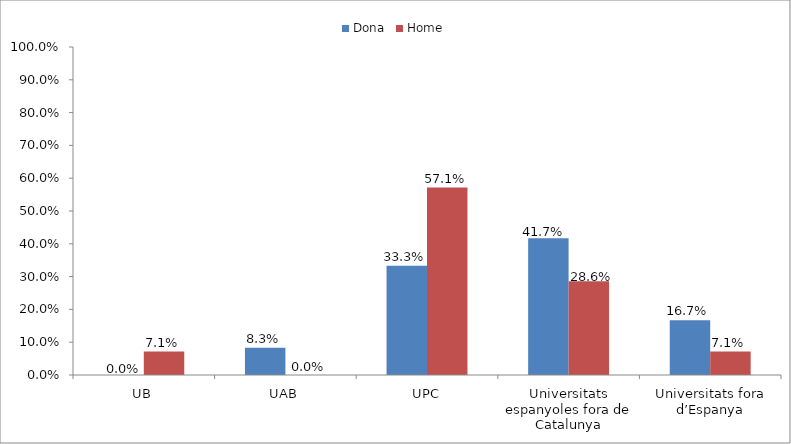
| Category | Dona | Home |
|---|---|---|
| UB | 0 | 0.071 |
| UAB | 0.083 | 0 |
| UPC | 0.333 | 0.571 |
| Universitats espanyoles fora de Catalunya | 0.417 | 0.286 |
| Universitats fora d’Espanya | 0.167 | 0.071 |